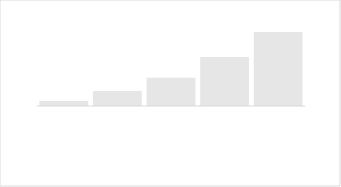
| Category | Series 0 |
|---|---|
| Supporter | 13 |
| Practitioner | 38 |
| Promoter | 72 |
| Performer | 125 |
| Advocate | 190 |